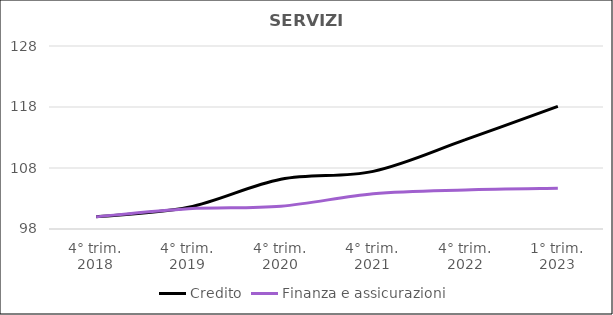
| Category | Credito | Finanza e assicurazioni  |
|---|---|---|
| 4° trim.
2018 | 100 | 100 |
| 4° trim.
2019 | 101.558 | 101.313 |
| 4° trim.
2020 | 106.147 | 101.733 |
| 4° trim.
2021 | 107.446 | 103.782 |
| 4° trim.
2022 | 112.641 | 104.412 |
| 1° trim.
2023 | 118.095 | 104.674 |